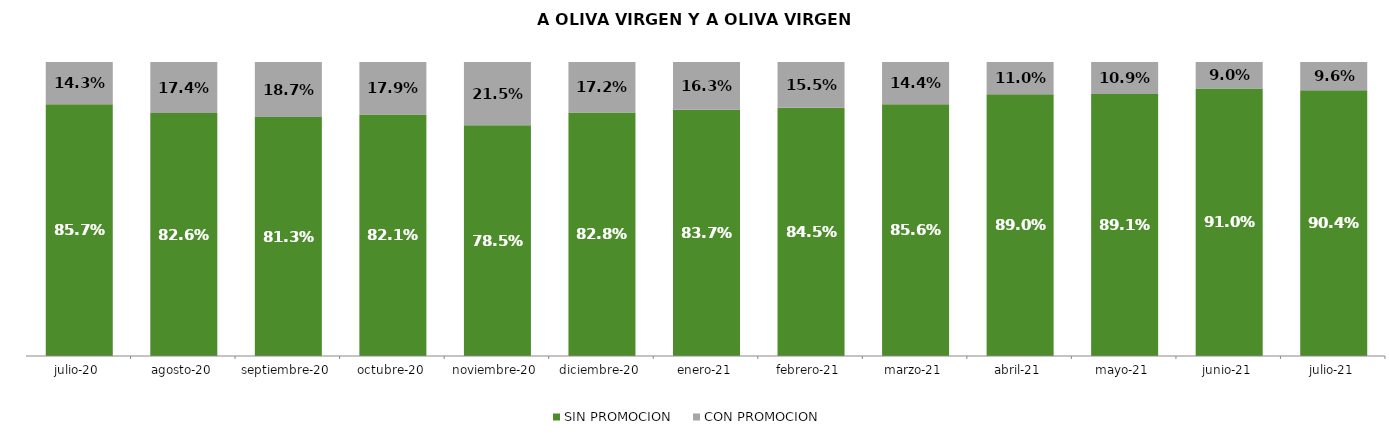
| Category | SIN PROMOCION   | CON PROMOCION   |
|---|---|---|
| 2020-07-01 | 0.857 | 0.143 |
| 2020-08-01 | 0.826 | 0.174 |
| 2020-09-01 | 0.813 | 0.187 |
| 2020-10-01 | 0.821 | 0.179 |
| 2020-11-01 | 0.785 | 0.215 |
| 2020-12-01 | 0.828 | 0.172 |
| 2021-01-01 | 0.837 | 0.163 |
| 2021-02-01 | 0.845 | 0.155 |
| 2021-03-01 | 0.856 | 0.144 |
| 2021-04-01 | 0.89 | 0.11 |
| 2021-05-01 | 0.891 | 0.109 |
| 2021-06-01 | 0.91 | 0.09 |
| 2021-07-01 | 0.904 | 0.096 |